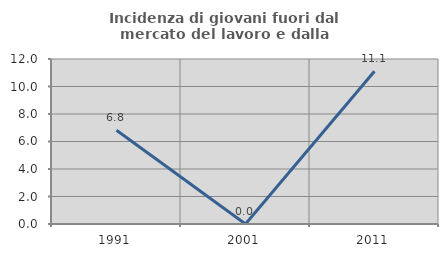
| Category | Incidenza di giovani fuori dal mercato del lavoro e dalla formazione  |
|---|---|
| 1991.0 | 6.818 |
| 2001.0 | 0 |
| 2011.0 | 11.111 |